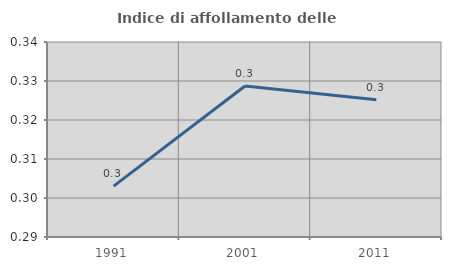
| Category | Indice di affollamento delle abitazioni  |
|---|---|
| 1991.0 | 0.303 |
| 2001.0 | 0.329 |
| 2011.0 | 0.325 |